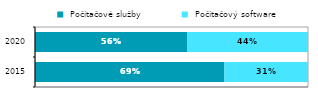
| Category |  Počítačové služby |  Počítačový software |
|---|---|---|
|  2015 | 0.694 | 0.306 |
|  2020 | 0.557 | 0.443 |